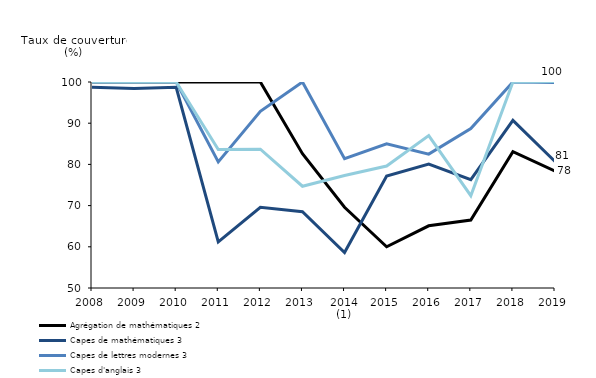
| Category | Agrégation de mathématiques 2 | Capes de mathématiques 3 | Capes de lettres modernes 3 | Capes d'anglais 3 |
|---|---|---|---|---|
| 2008 | 100 | 98.7 | 100 | 100 |
| 2009 | 100 | 98.4 | 100 | 100 |
| 2010 | 100 | 98.7 | 100 | 100 |
| 2011 | 100 | 61.2 | 80.6 | 83.6 |
| 2012 | 100 | 69.6 | 92.9 | 83.7 |
| 2013 | 82.6 | 68.5 | 100 | 74.7 |
| 2014 (1) | 69.6 | 58.6 | 81.4 | 77.3 |
| 2015 | 60 | 77.2 | 85 | 79.6 |
| 2016 | 65.1 | 80.1 | 82.5 | 87 |
| 2017 | 66.5 | 76.3 | 88.7 | 72.4 |
| 2018 | 83.1 | 90.7 | 100 | 100 |
| 2019 | 78.4 | 80.7 | 99.9 | 100.1 |